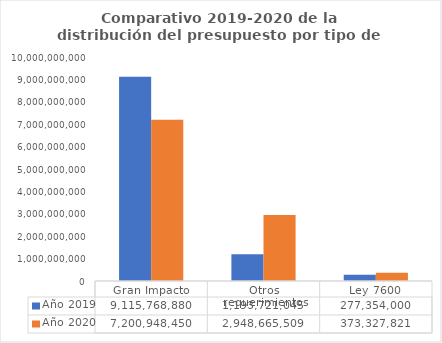
| Category | Año 2019 | Año 2020 |
|---|---|---|
| Gran Impacto | 9115768880.24 | 7200948449.89 |
| Otros requerimientos | 1193721045 | 2948665508.91 |
| Ley 7600 | 277354000 | 373327821.2 |